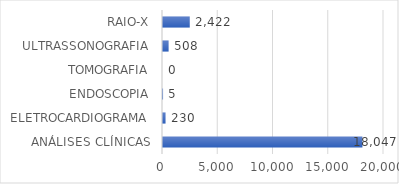
| Category | Series 0 |
|---|---|
| ANÁLISES CLÍNICAS | 18047 |
| ELETROCARDIOGRAMA | 230 |
| ENDOSCOPIA | 5 |
| TOMOGRAFIA | 0 |
| ULTRASSONOGRAFIA | 508 |
| RAIO-X | 2422 |